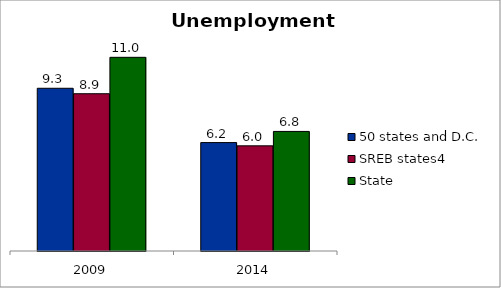
| Category | 50 states and D.C. | SREB states4 | State |
|---|---|---|---|
| 2009.0 | 9.254 | 8.944 | 11.015 |
| 2014.0 | 6.166 | 5.981 | 6.8 |